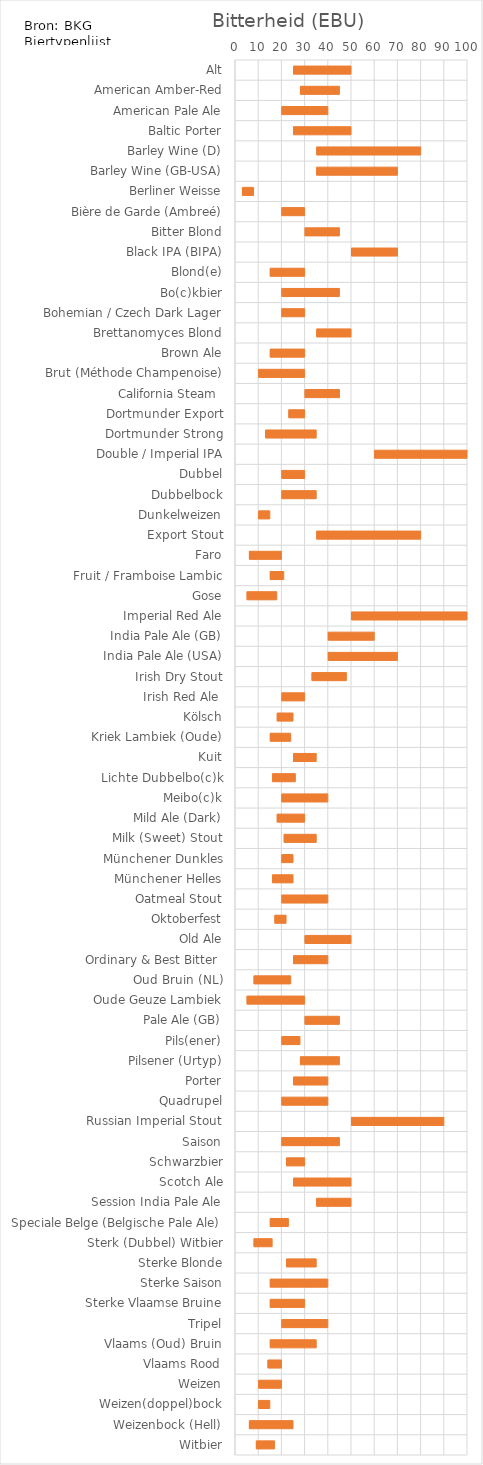
| Category | EBUMIN | EBUDELTA |
|---|---|---|
| Alt | 25 | 25 |
| American Amber-Red | 28 | 17 |
| American Pale Ale | 20 | 20 |
| Baltic Porter | 25 | 25 |
| Barley Wine (D) | 35 | 45 |
| Barley Wine (GB-USA) | 35 | 35 |
| Berliner Weisse | 3 | 5 |
| Bière de Garde (Ambreé) | 20 | 10 |
| Bitter Blond | 30 | 15 |
| Black IPA (BIPA) | 50 | 20 |
| Blond(e) | 15 | 15 |
| Bo(c)kbier | 20 | 25 |
| Bohemian / Czech Dark Lager | 20 | 10 |
| Brettanomyces Blond | 35 | 15 |
| Brown Ale | 15 | 15 |
| Brut (Méthode Champenoise) | 10 | 20 |
| California Steam  | 30 | 15 |
| Dortmunder Export | 23 | 7 |
| Dortmunder Strong | 13 | 22 |
| Double / Imperial IPA | 60 | 60 |
| Dubbel | 20 | 10 |
| Dubbelbock | 20 | 15 |
| Dunkelweizen | 10 | 5 |
| Export Stout | 35 | 45 |
| Faro | 6 | 14 |
| Fruit / Framboise Lambic | 15 | 6 |
| Gose | 5 | 13 |
| Imperial Red Ale | 50 | 50 |
| India Pale Ale (GB) | 40 | 20 |
| India Pale Ale (USA) | 40 | 30 |
| Irish Dry Stout | 33 | 15 |
| Irish Red Ale  | 20 | 10 |
| Kölsch | 18 | 7 |
| Kriek Lambiek (Oude) | 15 | 9 |
| Kuit | 25 | 10 |
| Lichte Dubbelbo(c)k | 16 | 10 |
| Meibo(c)k | 20 | 20 |
| Mild Ale (Dark) | 18 | 12 |
| Milk (Sweet) Stout | 21 | 14 |
| Münchener Dunkles | 20 | 5 |
| Münchener Helles | 16 | 9 |
| Oatmeal Stout | 20 | 20 |
| Oktoberfest | 17 | 5 |
| Old Ale | 30 | 20 |
| Ordinary & Best Bitter  | 25 | 15 |
| Oud Bruin (NL) | 8 | 16 |
| Oude Geuze Lambiek | 5 | 25 |
| Pale Ale (GB) | 30 | 15 |
| Pils(ener) | 20 | 8 |
| Pilsener (Urtyp) | 28 | 17 |
| Porter | 25 | 15 |
| Quadrupel | 20 | 20 |
| Russian Imperial Stout | 50 | 40 |
| Saison | 20 | 25 |
| Schwarzbier | 22 | 8 |
| Scotch Ale | 25 | 25 |
| Session India Pale Ale | 35 | 15 |
| Speciale Belge (Belgische Pale Ale) | 15 | 8 |
| Sterk (Dubbel) Witbier | 8 | 8 |
| Sterke Blonde | 22 | 13 |
| Sterke Saison | 15 | 25 |
| Sterke Vlaamse Bruine | 15 | 15 |
| Tripel | 20 | 20 |
| Vlaams (Oud) Bruin | 15 | 20 |
| Vlaams Rood | 14 | 6 |
| Weizen | 10 | 10 |
| Weizen(doppel)bock | 10 | 5 |
| Weizenbock (Hell) | 6 | 19 |
| Witbier | 9 | 8 |